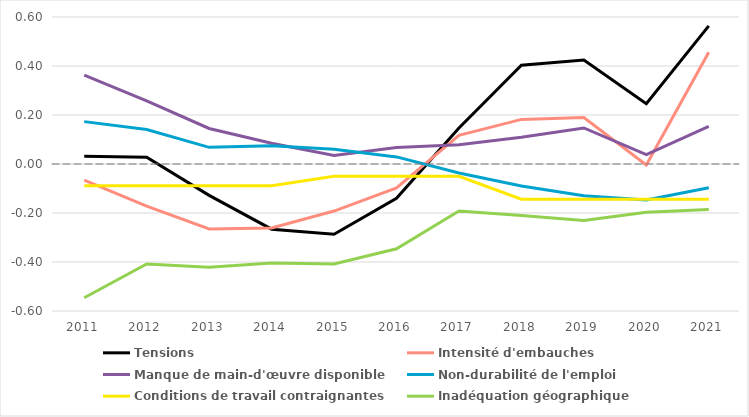
| Category | Tensions | Intensité d'embauches | Manque de main-d'œuvre disponible | Non-durabilité de l'emploi | Conditions de travail contraignantes | Inadéquation géographique |
|---|---|---|---|---|---|---|
| 2011.0 | 0.032 | -0.066 | 0.363 | 0.173 | -0.089 | -0.546 |
| 2012.0 | 0.028 | -0.172 | 0.258 | 0.141 | -0.089 | -0.408 |
| 2013.0 | -0.128 | -0.265 | 0.145 | 0.068 | -0.089 | -0.421 |
| 2014.0 | -0.266 | -0.261 | 0.085 | 0.074 | -0.089 | -0.404 |
| 2015.0 | -0.287 | -0.192 | 0.035 | 0.06 | -0.05 | -0.408 |
| 2016.0 | -0.14 | -0.098 | 0.067 | 0.029 | -0.05 | -0.346 |
| 2017.0 | 0.147 | 0.117 | 0.079 | -0.037 | -0.05 | -0.192 |
| 2018.0 | 0.403 | 0.182 | 0.109 | -0.09 | -0.144 | -0.21 |
| 2019.0 | 0.424 | 0.19 | 0.147 | -0.13 | -0.144 | -0.231 |
| 2020.0 | 0.246 | -0.004 | 0.038 | -0.147 | -0.144 | -0.197 |
| 2021.0 | 0.564 | 0.456 | 0.154 | -0.097 | -0.144 | -0.186 |